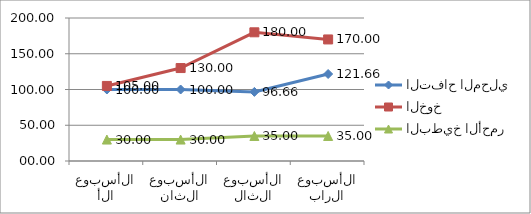
| Category | التفاح المحلي | الخوخ | البطيخ الأحمر |
|---|---|---|---|
| 0 | 100 | 105 | 30 |
| 1 | 100 | 130 | 30 |
| 2 | 96.66 | 180 | 35 |
| 3 | 121.66 | 170 | 35 |